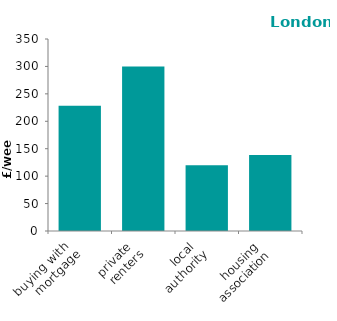
| Category | London |
|---|---|
| buying with 
mortgage | 228.187 |
| private 
renters | 299.915 |
| local 
authority | 119.955 |
| housing 
association | 138.667 |